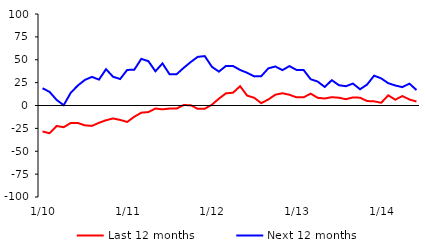
| Category | Last 12 months | Next 12 months |
|---|---|---|
|  1/10 | -28.38 | 18.87 |
|  2/10 | -30.28 | 14.86 |
|  3/10 | -22.41 | 6.12 |
|  4/10 | -23.71 | 0.35 |
|  5/10 | -19.08 | 13.92 |
|  6/10 | -19.11 | 21.81 |
|  7/10 | -21.66 | 27.94 |
|  8/10 | -22.29 | 31.28 |
|  9/10 | -18.88 | 28.29 |
|  10/10 | -16.12 | 39.67 |
|  11/10 | -14.18 | 31.39 |
|  12/10 | -15.78 | 28.96 |
|  1/11 | -17.96 | 38.89 |
|  2/11 | -12.33 | 39.05 |
|  3/11 | -7.84 | 50.96 |
|  4/11 | -7.2 | 48.47 |
|  5/11 | -3.3 | 37.42 |
|  6/11 | -4.21 | 45.99 |
|  7/11 | -3.33 | 34.17 |
|  8/11 | -3.33 | 34.17 |
|  9/11 | 0.51 | 41.09 |
|  10/11 | 0.28 | 47.47 |
|  11/11 | -3.65 | 53.17 |
|  12/11 | -3.52 | 53.99 |
|  1/12 | 0.85 | 42.3 |
|  2/12 | 7.49 | 37.02 |
|  3/12 | 13.29 | 43.26 |
|  4/12 | 13.96 | 43.14 |
|  5/12 | 21.08 | 38.87 |
|  6/12 | 10.81 | 35.74 |
|  7/12 | 8.46 | 31.81 |
|  8/12 | 2.55 | 32.03 |
|  9/12 | 6.58 | 40.6 |
|  10/12 | 11.79 | 42.65 |
|  11/12 | 13.41 | 38.66 |
|  12/12 | 11.71 | 43.07 |
|  1/13 | 8.92 | 38.82 |
|  2/13 | 8.92 | 38.82 |
|  3/13 | 12.98 | 28.75 |
|  4/13 | 8.4 | 26.12 |
|  5/13 | 7.64 | 20.26 |
|  6/13 | 9.1 | 27.71 |
|  7/13 | 8.51 | 22.2 |
|  8/13 | 6.89 | 21.06 |
|  9/13 | 8.81 | 23.95 |
|  10/13 | 8.54 | 17.76 |
|  11/13 | 4.88 | 22.87 |
|  12/13 | 4.53 | 32.62 |
|  1/14 | 2.99 | 29.64 |
|  2/14 | 11.1 | 24.37 |
|  3/14 | 6.35 | 21.86 |
|  4/14 | 10.34 | 20.09 |
|  5/14 | 6.57 | 23.91 |
|  6/14 | 4.33 | 16.91 |